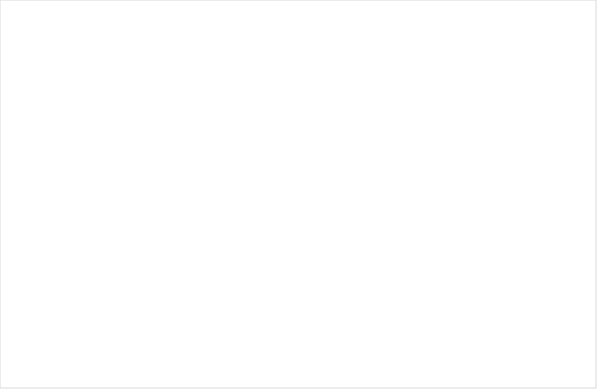
| Category | Ingen brist | Föreläggande | Föreläggande vid vite |
|---|---|---|---|
| Enskild en enhet | 0.75 | 0.125 | 0.125 |
| Enskild flera enhet | 0.842 | 0.158 | 0 |
| Offentlig | 0.879 | 0.111 | 0.01 |